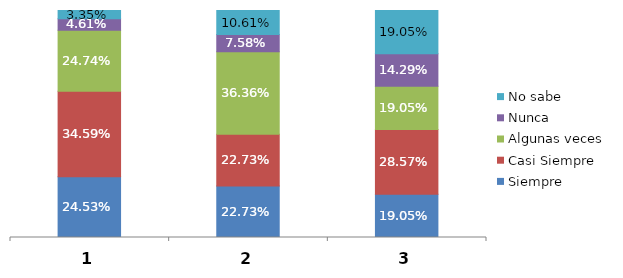
| Category | Siempre | Casi Siempre | Algunas veces | Nunca | No sabe |
|---|---|---|---|---|---|
| 0 | 0.245 | 0.346 | 0.247 | 0.046 | 0.034 |
| 1 | 0.227 | 0.227 | 0.364 | 0.076 | 0.106 |
| 2 | 0.19 | 0.286 | 0.19 | 0.143 | 0.19 |